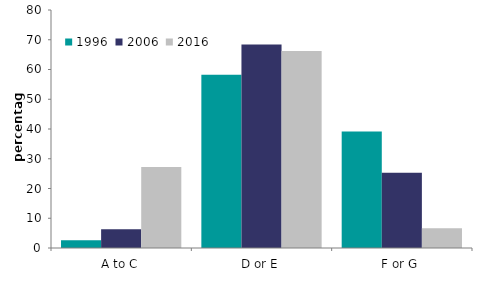
| Category | 1996 | 2006 | 2016 |
|---|---|---|---|
| A to C | 2.606 | 6.315 | 27.223 |
| D or E | 58.257 | 68.362 | 66.179 |
| F or G | 39.136 | 25.324 | 6.598 |